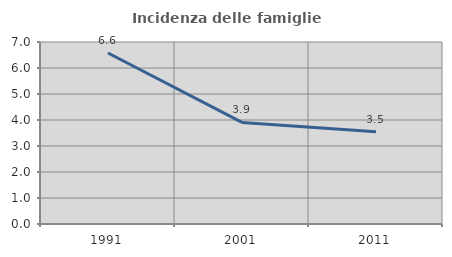
| Category | Incidenza delle famiglie numerose |
|---|---|
| 1991.0 | 6.578 |
| 2001.0 | 3.907 |
| 2011.0 | 3.547 |